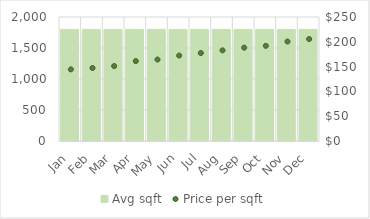
| Category | Avg sqft |
|---|---|
| Jan | 1800 |
| Feb | 1800 |
| Mar | 1800 |
| Apr | 1800 |
| May | 1800 |
| Jun | 1800 |
| Jul | 1800 |
| Aug | 1800 |
| Sep | 1800 |
| Oct | 1800 |
| Nov | 1800 |
| Dec | 1800 |